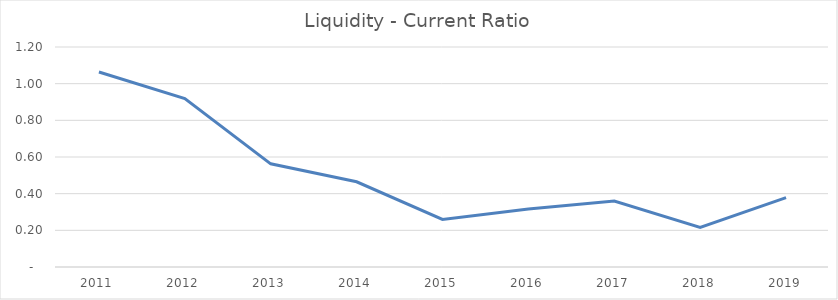
| Category | Series 0 |
|---|---|
| 2011.0 | 1.063 |
| 2012.0 | 0.919 |
| 2013.0 | 0.563 |
| 2014.0 | 0.465 |
| 2015.0 | 0.259 |
| 2016.0 | 0.316 |
| 2017.0 | 0.359 |
| 2018.0 | 0.216 |
| 2019.0 | 0.378 |